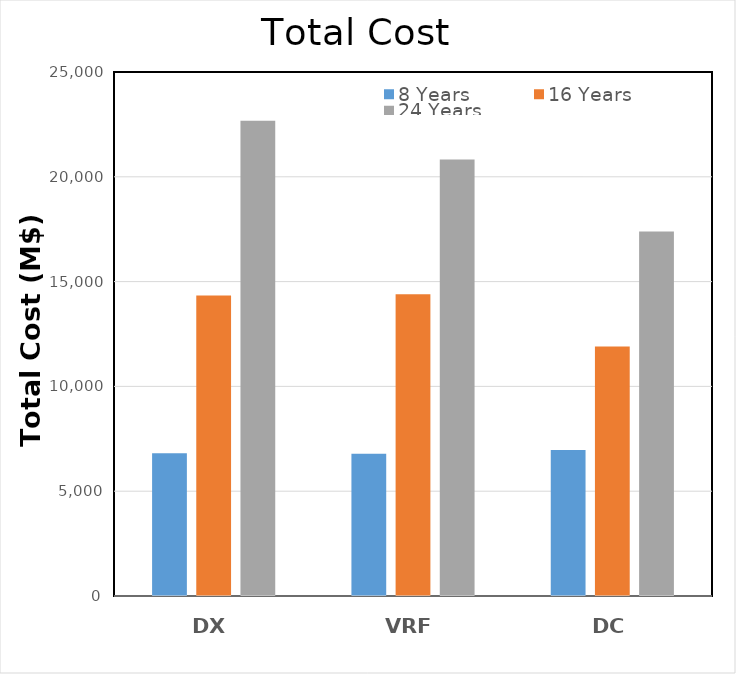
| Category | 8 Years | 16 Years | 24 Years |
|---|---|---|---|
| DX | 6805.975 | 14331.535 | 22668.508 |
| VRF  | 6788.772 | 14400.059 | 20828.696 |
| DC | 6966.208 | 11903.749 | 17394.977 |